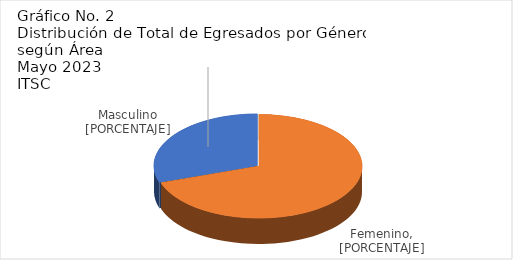
| Category | Series 0 |
|---|---|
| 0 | 201 |
| 1 | 87 |